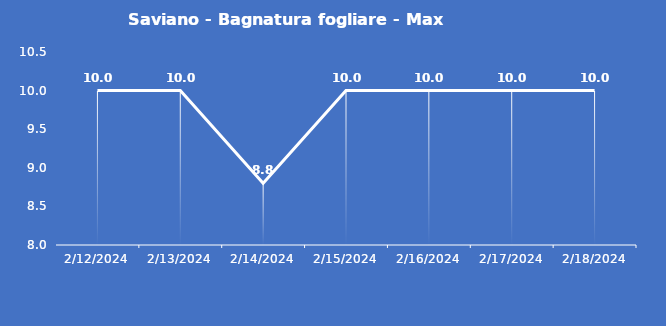
| Category | Saviano - Bagnatura fogliare - Max (min) |
|---|---|
| 2/12/24 | 10 |
| 2/13/24 | 10 |
| 2/14/24 | 8.8 |
| 2/15/24 | 10 |
| 2/16/24 | 10 |
| 2/17/24 | 10 |
| 2/18/24 | 10 |